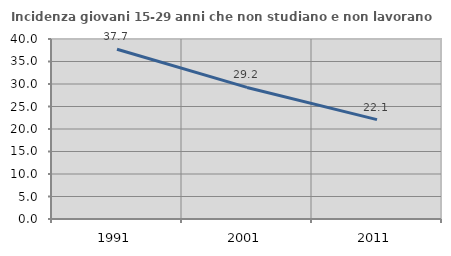
| Category | Incidenza giovani 15-29 anni che non studiano e non lavorano  |
|---|---|
| 1991.0 | 37.736 |
| 2001.0 | 29.238 |
| 2011.0 | 22.093 |